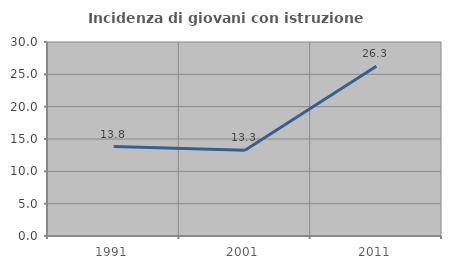
| Category | Incidenza di giovani con istruzione universitaria |
|---|---|
| 1991.0 | 13.838 |
| 2001.0 | 13.253 |
| 2011.0 | 26.256 |